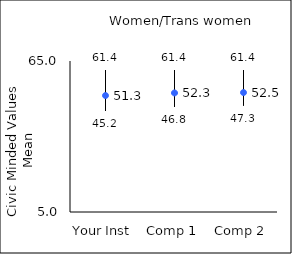
| Category | 25th percentile | 75th percentile | Mean |
|---|---|---|---|
| Your Inst | 45.2 | 61.4 | 51.27 |
| Comp 1 | 46.8 | 61.4 | 52.31 |
| Comp 2 | 47.3 | 61.4 | 52.47 |